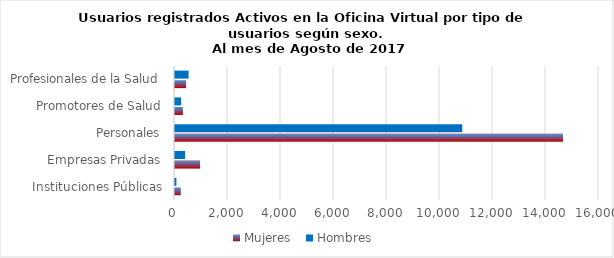
| Category | Mujeres | Hombres |
|---|---|---|
| Instituciones Públicas | 218 | 53 |
| Empresas Privadas | 946 | 381 |
| Personales | 14642 | 10841 |
| Promotores de Salud | 298 | 233 |
| Profesionales de la Salud | 420 | 512 |